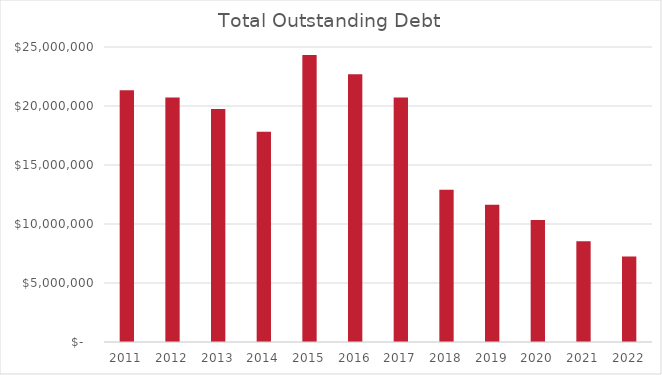
| Category | Series 0 |
|---|---|
| 2011.0 | 21335837 |
| 2012.0 | 20710102 |
| 2013.0 | 19739093 |
| 2014.0 | 17814600 |
| 2015.0 | 24320495 |
| 2016.0 | 22685134 |
| 2017.0 | 20715728 |
| 2018.0 | 12911321 |
| 2019.0 | 11641096 |
| 2020.0 | 10340871 |
| 2021.0 | 8540000 |
| 2022.0 | 7250000 |